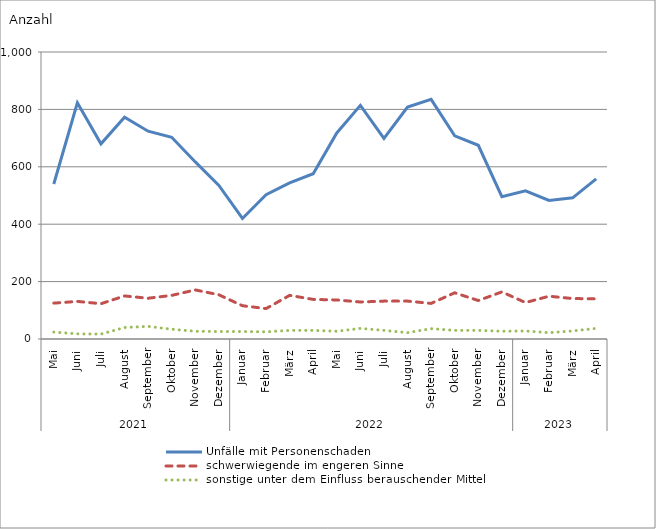
| Category | Unfälle mit Personenschaden | schwerwiegende im engeren Sinne | sonstige unter dem Einfluss berauschender Mittel |
|---|---|---|---|
| 0 | 540 | 125 | 24 |
| 1 | 823 | 131 | 18 |
| 2 | 680 | 123 | 17 |
| 3 | 773 | 150 | 40 |
| 4 | 724 | 142 | 44 |
| 5 | 703 | 152 | 34 |
| 6 | 617 | 171 | 27 |
| 7 | 535 | 154 | 26 |
| 8 | 420 | 116 | 26 |
| 9 | 503 | 106 | 25 |
| 10 | 544 | 152 | 30 |
| 11 | 576 | 138 | 30 |
| 12 | 718 | 136 | 27 |
| 13 | 814 | 129 | 37 |
| 14 | 699 | 132 | 30 |
| 15 | 808 | 132 | 22 |
| 16 | 835 | 124 | 36 |
| 17 | 708 | 161 | 30 |
| 18 | 675 | 134 | 30 |
| 19 | 496 | 164 | 27 |
| 20 | 516 | 127 | 28 |
| 21 | 483 | 149 | 22 |
| 22 | 492 | 141 | 28 |
| 23 | 558 | 140 | 37 |